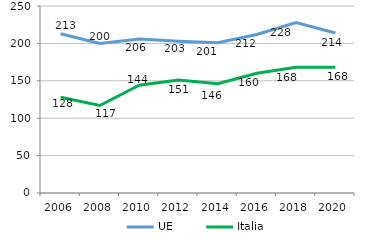
| Category | UE | Italia |
|---|---|---|
| 2006 | 213 | 128 |
| 2008 | 200 | 117 |
| 2010 | 206 | 144 |
| 2012 | 203 | 151 |
| 2014 | 201 | 146 |
| 2016 | 212 | 160 |
| 2018 | 228 | 168 |
| 2020 | 214 | 168 |